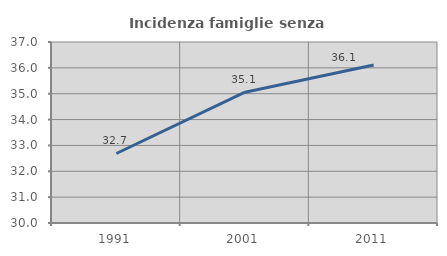
| Category | Incidenza famiglie senza nuclei |
|---|---|
| 1991.0 | 32.688 |
| 2001.0 | 35.057 |
| 2011.0 | 36.111 |